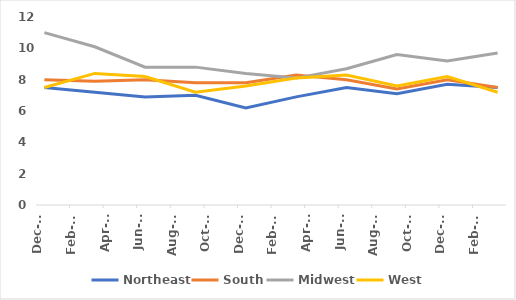
| Category | Northeast | South | Midwest | West |
|---|---|---|---|---|
| 2019-12-01 | 7.5 | 8 | 11 | 7.5 |
| 2020-03-01 | 7.2 | 7.9 | 10.1 | 8.4 |
| 2020-06-01 | 6.9 | 8 | 8.8 | 8.2 |
| 2020-09-01 | 7 | 7.8 | 8.8 | 7.2 |
| 2020-12-01 | 6.2 | 7.8 | 8.4 | 7.6 |
| 2021-03-01 | 6.9 | 8.3 | 8.1 | 8.1 |
| 2021-06-01 | 7.5 | 8 | 8.7 | 8.3 |
| 2021-09-01 | 7.1 | 7.4 | 9.6 | 7.6 |
| 2021-12-01 | 7.7 | 8 | 9.2 | 8.2 |
| 2022-03-01 | 7.5 | 7.5 | 9.7 | 7.2 |